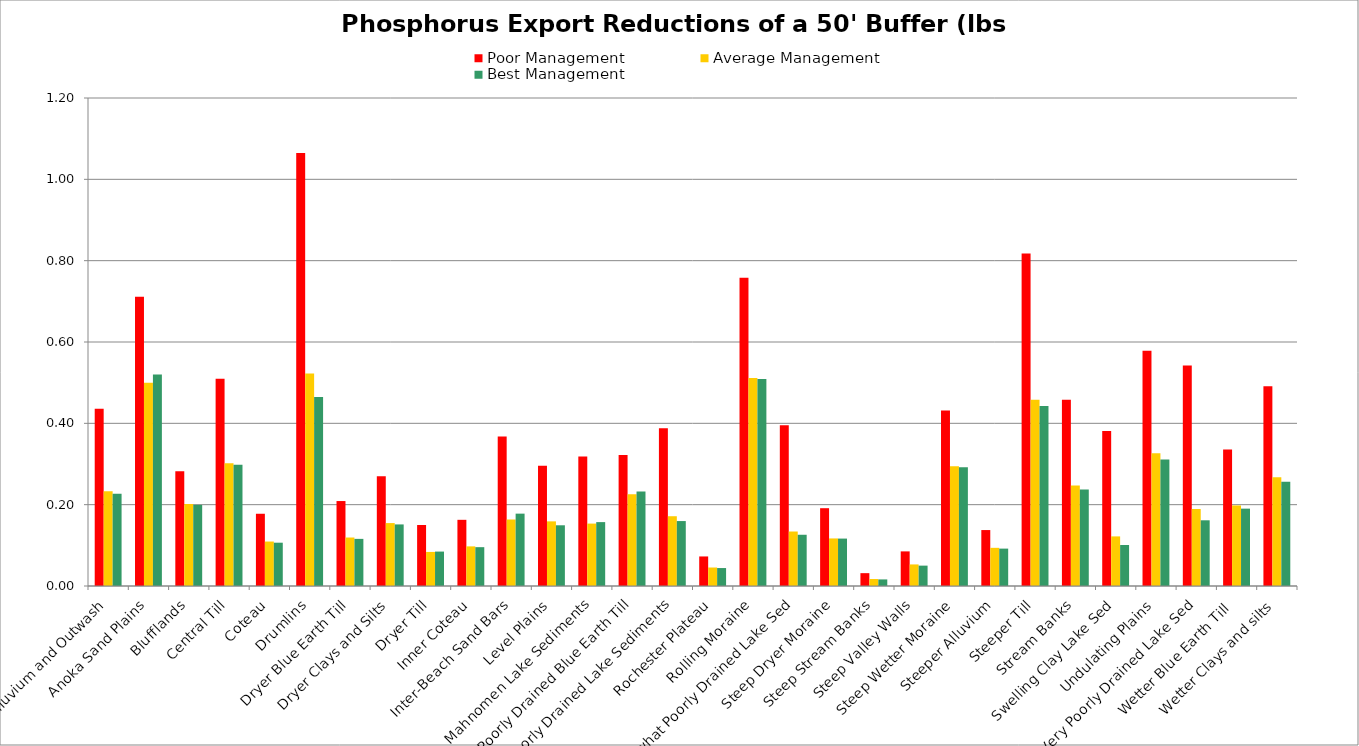
| Category | Poor Management | Average Management | Best Management |
|---|---|---|---|
| Alluvium and Outwash | 0.436 | 0.233 | 0.227 |
| Anoka Sand Plains | 0.711 | 0.5 | 0.52 |
| Blufflands | 0.282 | 0.202 | 0.199 |
| Central Till | 0.51 | 0.302 | 0.298 |
| Coteau | 0.178 | 0.109 | 0.106 |
| Drumlins | 1.065 | 0.522 | 0.465 |
| Dryer Blue Earth Till | 0.209 | 0.119 | 0.116 |
| Dryer Clays and Silts | 0.27 | 0.155 | 0.151 |
| Dryer Till | 0.15 | 0.084 | 0.085 |
| Inner Coteau | 0.163 | 0.097 | 0.095 |
| Inter-Beach Sand Bars | 0.367 | 0.164 | 0.178 |
| Level Plains | 0.296 | 0.159 | 0.149 |
| Mahnomen Lake Sediments | 0.318 | 0.153 | 0.157 |
| Poorly Drained Blue Earth Till | 0.322 | 0.226 | 0.233 |
| Poorly Drained Lake Sediments | 0.388 | 0.172 | 0.16 |
| Rochester Plateau | 0.073 | 0.045 | 0.044 |
| Rolling Moraine | 0.758 | 0.512 | 0.509 |
| Somewhat Poorly Drained Lake Sed | 0.395 | 0.134 | 0.126 |
| Steep Dryer Moraine | 0.191 | 0.117 | 0.117 |
| Steep Stream Banks | 0.032 | 0.017 | 0.016 |
| Steep Valley Walls | 0.085 | 0.053 | 0.05 |
| Steep Wetter Moraine | 0.431 | 0.294 | 0.292 |
| Steeper Alluvium | 0.138 | 0.094 | 0.092 |
| Steeper Till | 0.817 | 0.458 | 0.443 |
| Stream Banks | 0.458 | 0.247 | 0.238 |
| Swelling Clay Lake Sed | 0.381 | 0.122 | 0.101 |
| Undulating Plains | 0.578 | 0.327 | 0.311 |
| Very Poorly Drained Lake Sed | 0.543 | 0.189 | 0.162 |
| Wetter Blue Earth Till  | 0.336 | 0.198 | 0.19 |
| Wetter Clays and silts | 0.491 | 0.268 | 0.256 |